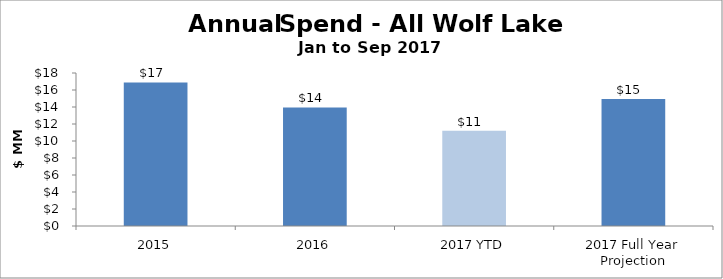
| Category | Total |
|---|---|
| 2015 | 16891071 |
| 2016 | 13945417 |
| 2017 YTD | 11213580 |
| 2017 Full Year Projection | 14951440 |